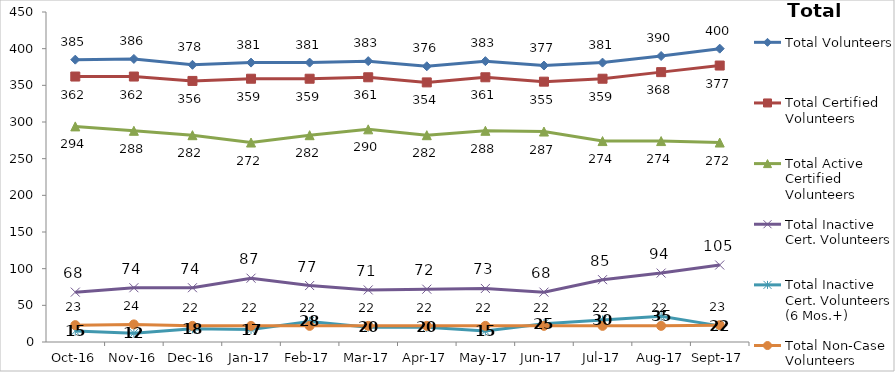
| Category | Total Volunteers | Total Certified Volunteers | Total Active Certified Volunteers | Total Inactive Cert. Volunteers | Total Inactive Cert. Volunteers (6 Mos.+) | Total Non-Case Volunteers |
|---|---|---|---|---|---|---|
| 2016-10-01 | 385 | 362 | 294 | 68 | 15 | 23 |
| 2016-11-01 | 386 | 362 | 288 | 74 | 12 | 24 |
| 2016-12-01 | 378 | 356 | 282 | 74 | 18 | 22 |
| 2017-01-01 | 381 | 359 | 272 | 87 | 17 | 22 |
| 2017-02-01 | 381 | 359 | 282 | 77 | 28 | 22 |
| 2017-03-01 | 383 | 361 | 290 | 71 | 20 | 22 |
| 2017-04-01 | 376 | 354 | 282 | 72 | 20 | 22 |
| 2017-05-01 | 383 | 361 | 288 | 73 | 15 | 22 |
| 2017-06-01 | 377 | 355 | 287 | 68 | 25 | 22 |
| 2017-07-01 | 381 | 359 | 274 | 85 | 30 | 22 |
| 2017-08-01 | 390 | 368 | 274 | 94 | 35 | 22 |
| 2017-09-01 | 400 | 377 | 272 | 105 | 22 | 23 |